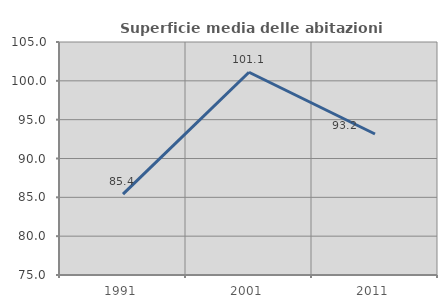
| Category | Superficie media delle abitazioni occupate |
|---|---|
| 1991.0 | 85.406 |
| 2001.0 | 101.108 |
| 2011.0 | 93.158 |